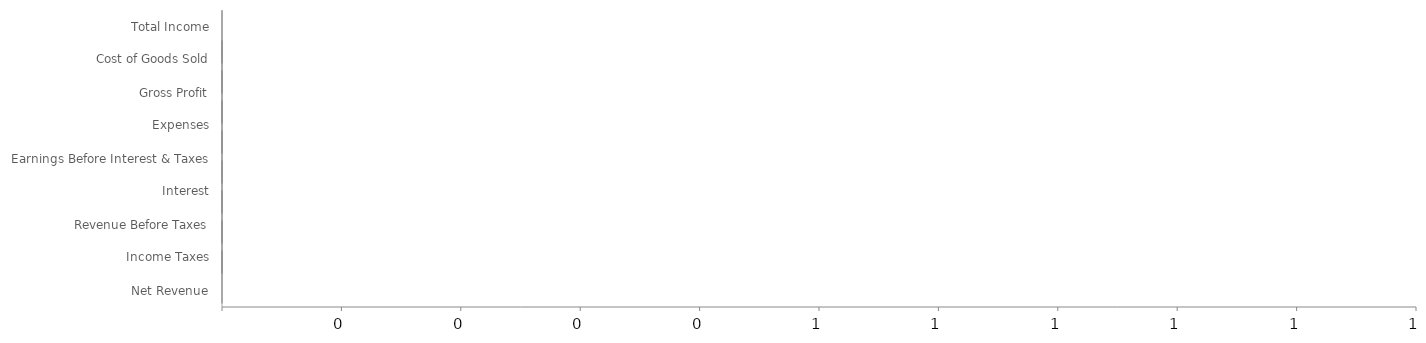
| Category | Ends | Blank | NegLoss | NegGain | PosLoss | PosGain |
|---|---|---|---|---|---|---|
| Total Income | 0 | 0 | 0 | 0 | 0 | 0 |
| Cost of Goods Sold | 0 | 0 | 0 | 0 | 0 | 0 |
| Gross Profit | 0 | 0 | 0 | 0 | 0 | 0 |
| Expenses | 0 | 0 | 0 | 0 | 0 | 0 |
| Earnings Before Interest & Taxes | 0 | 0 | 0 | 0 | 0 | 0 |
| Interest | 0 | 0 | 0 | 0 | 0 | 0 |
| Revenue Before Taxes | 0 | 0 | 0 | 0 | 0 | 0 |
| Income Taxes | 0 | 0 | 0 | 0 | 0 | 0 |
| Net Revenue | 0 | 0 | 0 | 0 | 0 | 0 |